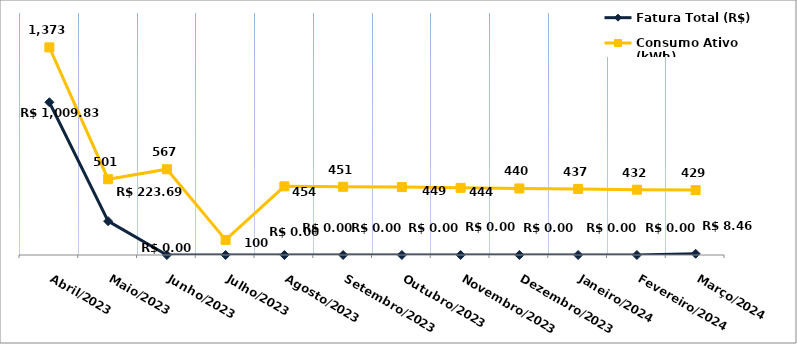
| Category | Fatura Total (R$) |
|---|---|
| Abril/2023 | 1009.83 |
| Maio/2023 | 223.69 |
| Junho/2023 | 0 |
| Julho/2023 | 0 |
| Agosto/2023 | 0 |
| Setembro/2023 | 0 |
| Outubro/2023 | 0 |
| Novembro/2023 | 0 |
| Dezembro/2023 | 0 |
| Janeiro/2024 | 0 |
| Fevereiro/2024 | 0 |
| Março/2024 | 8.46 |